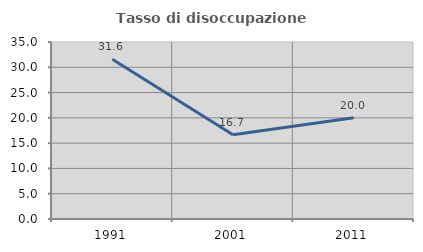
| Category | Tasso di disoccupazione giovanile  |
|---|---|
| 1991.0 | 31.579 |
| 2001.0 | 16.667 |
| 2011.0 | 20 |